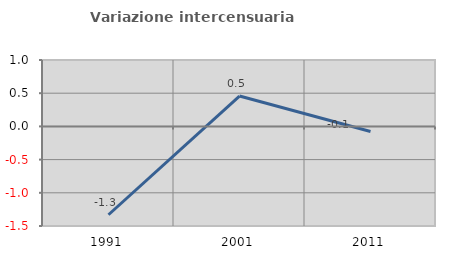
| Category | Variazione intercensuaria annua |
|---|---|
| 1991.0 | -1.33 |
| 2001.0 | 0.457 |
| 2011.0 | -0.077 |